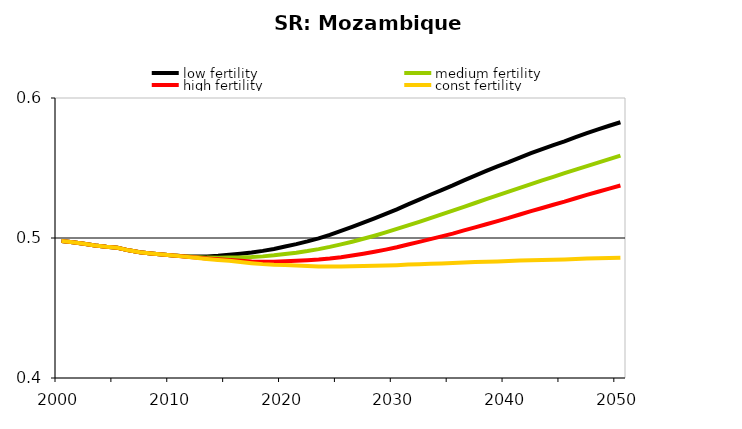
| Category | low fertility | medium fertility | high fertility | const fertility |
|---|---|---|---|---|
| 2000.0 | 0.498 | 0.498 | 0.498 | 0.498 |
| 2001.0 | 0.497 | 0.497 | 0.497 | 0.497 |
| 2002.0 | 0.496 | 0.496 | 0.496 | 0.496 |
| 2003.0 | 0.495 | 0.495 | 0.495 | 0.495 |
| 2004.0 | 0.494 | 0.494 | 0.494 | 0.494 |
| 2005.0 | 0.493 | 0.493 | 0.493 | 0.493 |
| 2006.0 | 0.491 | 0.491 | 0.491 | 0.491 |
| 2007.0 | 0.49 | 0.49 | 0.49 | 0.49 |
| 2008.0 | 0.489 | 0.489 | 0.489 | 0.489 |
| 2009.0 | 0.488 | 0.488 | 0.488 | 0.488 |
| 2010.0 | 0.487 | 0.487 | 0.487 | 0.487 |
| 2011.0 | 0.487 | 0.487 | 0.487 | 0.487 |
| 2012.0 | 0.487 | 0.486 | 0.486 | 0.486 |
| 2013.0 | 0.487 | 0.486 | 0.485 | 0.485 |
| 2014.0 | 0.487 | 0.486 | 0.485 | 0.484 |
| 2015.0 | 0.488 | 0.486 | 0.484 | 0.484 |
| 2016.0 | 0.489 | 0.486 | 0.484 | 0.483 |
| 2017.0 | 0.49 | 0.486 | 0.483 | 0.482 |
| 2018.0 | 0.491 | 0.487 | 0.483 | 0.481 |
| 2019.0 | 0.492 | 0.488 | 0.483 | 0.481 |
| 2020.0 | 0.494 | 0.489 | 0.483 | 0.481 |
| 2021.0 | 0.496 | 0.489 | 0.484 | 0.48 |
| 2022.0 | 0.498 | 0.491 | 0.484 | 0.48 |
| 2023.0 | 0.5 | 0.492 | 0.485 | 0.48 |
| 2024.0 | 0.502 | 0.494 | 0.485 | 0.48 |
| 2025.0 | 0.505 | 0.495 | 0.486 | 0.48 |
| 2026.0 | 0.508 | 0.497 | 0.487 | 0.48 |
| 2027.0 | 0.511 | 0.499 | 0.489 | 0.48 |
| 2028.0 | 0.514 | 0.502 | 0.49 | 0.48 |
| 2029.0 | 0.517 | 0.504 | 0.492 | 0.48 |
| 2030.0 | 0.52 | 0.506 | 0.493 | 0.481 |
| 2031.0 | 0.524 | 0.509 | 0.495 | 0.481 |
| 2032.0 | 0.527 | 0.512 | 0.497 | 0.481 |
| 2033.0 | 0.531 | 0.514 | 0.499 | 0.482 |
| 2034.0 | 0.534 | 0.517 | 0.501 | 0.482 |
| 2035.0 | 0.538 | 0.52 | 0.503 | 0.482 |
| 2036.0 | 0.541 | 0.522 | 0.505 | 0.482 |
| 2037.0 | 0.545 | 0.525 | 0.508 | 0.483 |
| 2038.0 | 0.548 | 0.528 | 0.51 | 0.483 |
| 2039.0 | 0.551 | 0.53 | 0.512 | 0.483 |
| 2040.0 | 0.554 | 0.533 | 0.514 | 0.484 |
| 2041.0 | 0.557 | 0.536 | 0.517 | 0.484 |
| 2042.0 | 0.561 | 0.538 | 0.519 | 0.484 |
| 2043.0 | 0.564 | 0.541 | 0.521 | 0.484 |
| 2044.0 | 0.566 | 0.544 | 0.524 | 0.485 |
| 2045.0 | 0.569 | 0.546 | 0.526 | 0.485 |
| 2046.0 | 0.572 | 0.549 | 0.528 | 0.485 |
| 2047.0 | 0.575 | 0.551 | 0.531 | 0.485 |
| 2048.0 | 0.578 | 0.554 | 0.533 | 0.485 |
| 2049.0 | 0.58 | 0.556 | 0.535 | 0.486 |
| 2050.0 | 0.583 | 0.559 | 0.537 | 0.486 |